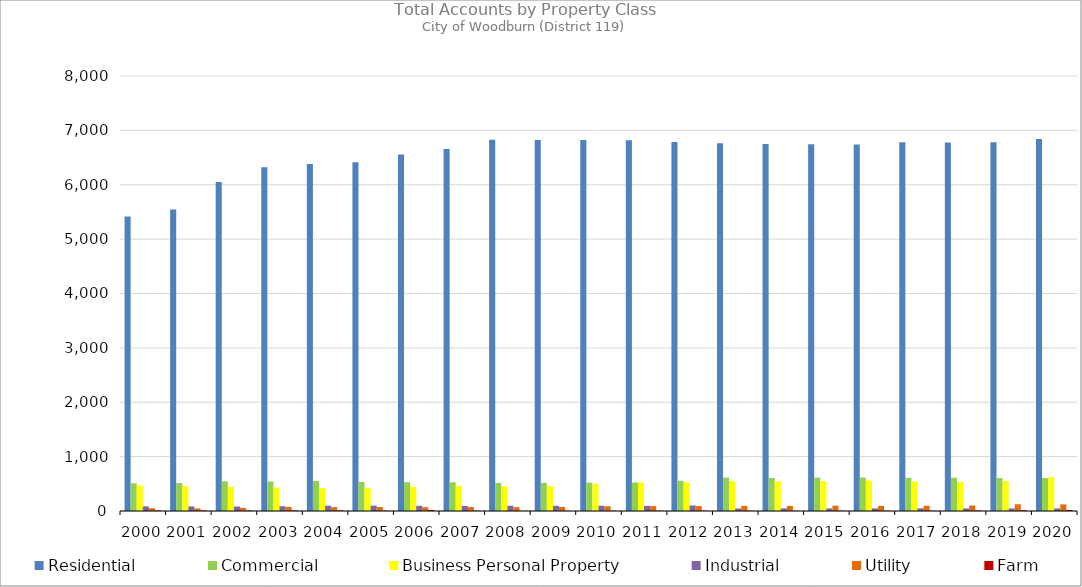
| Category | Residential | Commercial | Business Personal Property | Industrial | Utility | Farm |
|---|---|---|---|---|---|---|
| 2000.0 | 5418 | 511 | 468 | 85 | 51 | 10 |
| 2001.0 | 5546 | 514 | 458 | 84 | 47 | 11 |
| 2002.0 | 6051 | 545 | 443 | 82 | 58 | 11 |
| 2003.0 | 6323 | 542 | 433 | 88 | 75 | 11 |
| 2004.0 | 6381 | 551 | 418 | 97 | 70 | 11 |
| 2005.0 | 6415 | 534 | 423 | 98 | 73 | 7 |
| 2006.0 | 6555 | 530 | 446 | 95 | 70 | 17 |
| 2007.0 | 6658 | 528 | 467 | 93 | 72 | 5 |
| 2008.0 | 6828 | 517 | 453 | 96 | 71 | 3 |
| 2009.0 | 6823 | 517 | 456 | 95 | 75 | 3 |
| 2010.0 | 6825 | 522 | 501 | 97 | 87 | 6 |
| 2011.0 | 6820 | 523 | 527 | 95 | 90 | 6 |
| 2012.0 | 6787 | 556 | 531 | 102 | 90 | 6 |
| 2013.0 | 6762 | 614 | 546 | 45 | 93 | 6 |
| 2014.0 | 6750 | 609 | 546 | 48 | 93 | 5 |
| 2015.0 | 6747 | 613 | 551 | 48 | 98 | 6 |
| 2016.0 | 6740 | 616 | 559 | 47 | 93 | 6 |
| 2017.0 | 6781 | 610 | 543 | 49 | 96 | 6 |
| 2018.0 | 6775 | 612 | 532 | 47 | 101 | 11 |
| 2019.0 | 6783 | 606 | 551 | 47 | 124 | 14 |
| 2020.0 | 6843 | 606 | 625 | 47 | 122 | 18 |